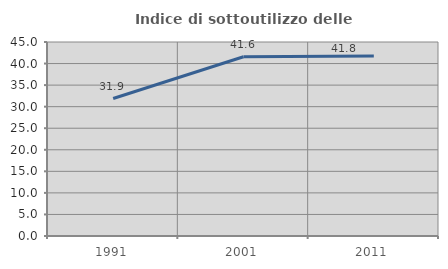
| Category | Indice di sottoutilizzo delle abitazioni  |
|---|---|
| 1991.0 | 31.89 |
| 2001.0 | 41.573 |
| 2011.0 | 41.772 |